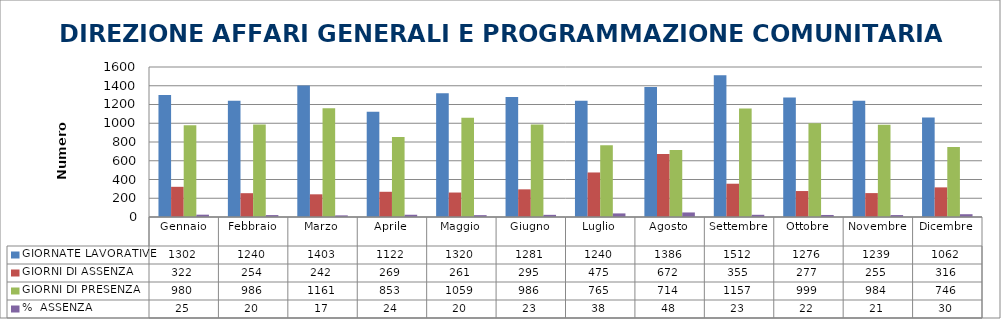
| Category | GIORNATE LAVORATIVE | GIORNI DI ASSENZA | GIORNI DI PRESENZA | %  ASSENZA |
|---|---|---|---|---|
| Gennaio | 1302 | 322 | 980 | 24.731 |
| Febbraio | 1240 | 254 | 986 | 20.484 |
| Marzo | 1403 | 242 | 1161 | 17.249 |
| Aprile | 1122 | 269 | 853 | 23.975 |
| Maggio | 1320 | 261 | 1059 | 19.773 |
| Giugno | 1281 | 295 | 986 | 23.029 |
| Luglio | 1240 | 475 | 765 | 38.306 |
| Agosto | 1386 | 672 | 714 | 48.485 |
| Settembre | 1512 | 355 | 1157 | 23.479 |
| Ottobre | 1276 | 277 | 999 | 21.708 |
| Novembre | 1239 | 255 | 984 | 20.581 |
| Dicembre | 1062 | 316 | 746 | 29.755 |